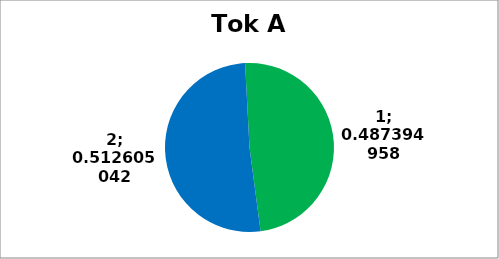
| Category | Series 0 |
|---|---|
| 0 | 116 |
| 1 | 122 |